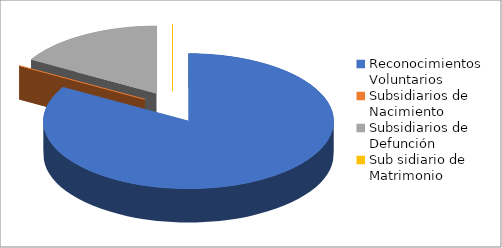
| Category | Series 0 |
|---|---|
| Reconocimientos Voluntarios  | 5 |
| Subsidiarios de Nacimiento | 0 |
| Subsidiarios de Defunción | 1 |
| Sub sidiario de Matrimonio | 0 |